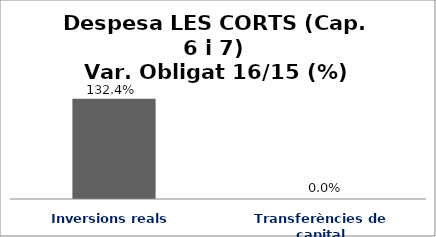
| Category | Series 0 |
|---|---|
| Inversions reals | 1.324 |
| Transferències de capital | 0 |